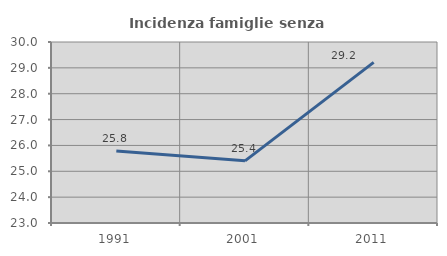
| Category | Incidenza famiglie senza nuclei |
|---|---|
| 1991.0 | 25.788 |
| 2001.0 | 25.404 |
| 2011.0 | 29.212 |